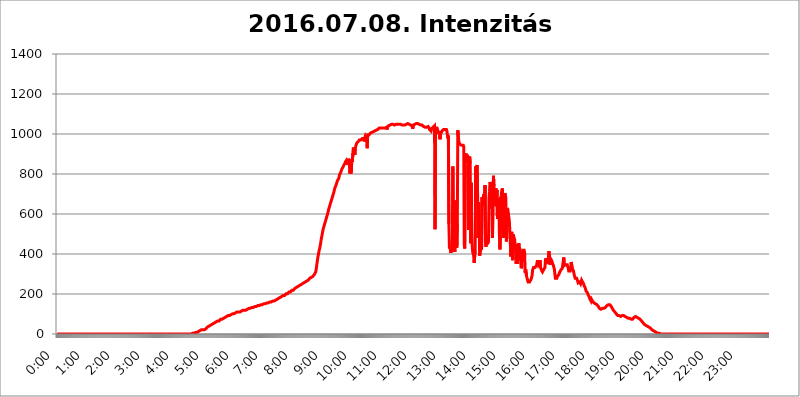
| Category | 2016.07.08. Intenzitás [W/m^2] |
|---|---|
| 0.0 | 0 |
| 0.0006944444444444445 | 0 |
| 0.001388888888888889 | 0 |
| 0.0020833333333333333 | 0 |
| 0.002777777777777778 | 0 |
| 0.003472222222222222 | 0 |
| 0.004166666666666667 | 0 |
| 0.004861111111111111 | 0 |
| 0.005555555555555556 | 0 |
| 0.0062499999999999995 | 0 |
| 0.006944444444444444 | 0 |
| 0.007638888888888889 | 0 |
| 0.008333333333333333 | 0 |
| 0.009027777777777779 | 0 |
| 0.009722222222222222 | 0 |
| 0.010416666666666666 | 0 |
| 0.011111111111111112 | 0 |
| 0.011805555555555555 | 0 |
| 0.012499999999999999 | 0 |
| 0.013194444444444444 | 0 |
| 0.013888888888888888 | 0 |
| 0.014583333333333332 | 0 |
| 0.015277777777777777 | 0 |
| 0.015972222222222224 | 0 |
| 0.016666666666666666 | 0 |
| 0.017361111111111112 | 0 |
| 0.018055555555555557 | 0 |
| 0.01875 | 0 |
| 0.019444444444444445 | 0 |
| 0.02013888888888889 | 0 |
| 0.020833333333333332 | 0 |
| 0.02152777777777778 | 0 |
| 0.022222222222222223 | 0 |
| 0.02291666666666667 | 0 |
| 0.02361111111111111 | 0 |
| 0.024305555555555556 | 0 |
| 0.024999999999999998 | 0 |
| 0.025694444444444447 | 0 |
| 0.02638888888888889 | 0 |
| 0.027083333333333334 | 0 |
| 0.027777777777777776 | 0 |
| 0.02847222222222222 | 0 |
| 0.029166666666666664 | 0 |
| 0.029861111111111113 | 0 |
| 0.030555555555555555 | 0 |
| 0.03125 | 0 |
| 0.03194444444444445 | 0 |
| 0.03263888888888889 | 0 |
| 0.03333333333333333 | 0 |
| 0.034027777777777775 | 0 |
| 0.034722222222222224 | 0 |
| 0.035416666666666666 | 0 |
| 0.036111111111111115 | 0 |
| 0.03680555555555556 | 0 |
| 0.0375 | 0 |
| 0.03819444444444444 | 0 |
| 0.03888888888888889 | 0 |
| 0.03958333333333333 | 0 |
| 0.04027777777777778 | 0 |
| 0.04097222222222222 | 0 |
| 0.041666666666666664 | 0 |
| 0.042361111111111106 | 0 |
| 0.04305555555555556 | 0 |
| 0.043750000000000004 | 0 |
| 0.044444444444444446 | 0 |
| 0.04513888888888889 | 0 |
| 0.04583333333333334 | 0 |
| 0.04652777777777778 | 0 |
| 0.04722222222222222 | 0 |
| 0.04791666666666666 | 0 |
| 0.04861111111111111 | 0 |
| 0.049305555555555554 | 0 |
| 0.049999999999999996 | 0 |
| 0.05069444444444445 | 0 |
| 0.051388888888888894 | 0 |
| 0.052083333333333336 | 0 |
| 0.05277777777777778 | 0 |
| 0.05347222222222222 | 0 |
| 0.05416666666666667 | 0 |
| 0.05486111111111111 | 0 |
| 0.05555555555555555 | 0 |
| 0.05625 | 0 |
| 0.05694444444444444 | 0 |
| 0.057638888888888885 | 0 |
| 0.05833333333333333 | 0 |
| 0.05902777777777778 | 0 |
| 0.059722222222222225 | 0 |
| 0.06041666666666667 | 0 |
| 0.061111111111111116 | 0 |
| 0.06180555555555556 | 0 |
| 0.0625 | 0 |
| 0.06319444444444444 | 0 |
| 0.06388888888888888 | 0 |
| 0.06458333333333334 | 0 |
| 0.06527777777777778 | 0 |
| 0.06597222222222222 | 0 |
| 0.06666666666666667 | 0 |
| 0.06736111111111111 | 0 |
| 0.06805555555555555 | 0 |
| 0.06874999999999999 | 0 |
| 0.06944444444444443 | 0 |
| 0.07013888888888889 | 0 |
| 0.07083333333333333 | 0 |
| 0.07152777777777779 | 0 |
| 0.07222222222222223 | 0 |
| 0.07291666666666667 | 0 |
| 0.07361111111111111 | 0 |
| 0.07430555555555556 | 0 |
| 0.075 | 0 |
| 0.07569444444444444 | 0 |
| 0.0763888888888889 | 0 |
| 0.07708333333333334 | 0 |
| 0.07777777777777778 | 0 |
| 0.07847222222222222 | 0 |
| 0.07916666666666666 | 0 |
| 0.0798611111111111 | 0 |
| 0.08055555555555556 | 0 |
| 0.08125 | 0 |
| 0.08194444444444444 | 0 |
| 0.08263888888888889 | 0 |
| 0.08333333333333333 | 0 |
| 0.08402777777777777 | 0 |
| 0.08472222222222221 | 0 |
| 0.08541666666666665 | 0 |
| 0.08611111111111112 | 0 |
| 0.08680555555555557 | 0 |
| 0.08750000000000001 | 0 |
| 0.08819444444444445 | 0 |
| 0.08888888888888889 | 0 |
| 0.08958333333333333 | 0 |
| 0.09027777777777778 | 0 |
| 0.09097222222222222 | 0 |
| 0.09166666666666667 | 0 |
| 0.09236111111111112 | 0 |
| 0.09305555555555556 | 0 |
| 0.09375 | 0 |
| 0.09444444444444444 | 0 |
| 0.09513888888888888 | 0 |
| 0.09583333333333333 | 0 |
| 0.09652777777777777 | 0 |
| 0.09722222222222222 | 0 |
| 0.09791666666666667 | 0 |
| 0.09861111111111111 | 0 |
| 0.09930555555555555 | 0 |
| 0.09999999999999999 | 0 |
| 0.10069444444444443 | 0 |
| 0.1013888888888889 | 0 |
| 0.10208333333333335 | 0 |
| 0.10277777777777779 | 0 |
| 0.10347222222222223 | 0 |
| 0.10416666666666667 | 0 |
| 0.10486111111111111 | 0 |
| 0.10555555555555556 | 0 |
| 0.10625 | 0 |
| 0.10694444444444444 | 0 |
| 0.1076388888888889 | 0 |
| 0.10833333333333334 | 0 |
| 0.10902777777777778 | 0 |
| 0.10972222222222222 | 0 |
| 0.1111111111111111 | 0 |
| 0.11180555555555556 | 0 |
| 0.11180555555555556 | 0 |
| 0.1125 | 0 |
| 0.11319444444444444 | 0 |
| 0.11388888888888889 | 0 |
| 0.11458333333333333 | 0 |
| 0.11527777777777777 | 0 |
| 0.11597222222222221 | 0 |
| 0.11666666666666665 | 0 |
| 0.1173611111111111 | 0 |
| 0.11805555555555557 | 0 |
| 0.11944444444444445 | 0 |
| 0.12013888888888889 | 0 |
| 0.12083333333333333 | 0 |
| 0.12152777777777778 | 0 |
| 0.12222222222222223 | 0 |
| 0.12291666666666667 | 0 |
| 0.12291666666666667 | 0 |
| 0.12361111111111112 | 0 |
| 0.12430555555555556 | 0 |
| 0.125 | 0 |
| 0.12569444444444444 | 0 |
| 0.12638888888888888 | 0 |
| 0.12708333333333333 | 0 |
| 0.16875 | 0 |
| 0.12847222222222224 | 0 |
| 0.12916666666666668 | 0 |
| 0.12986111111111112 | 0 |
| 0.13055555555555556 | 0 |
| 0.13125 | 0 |
| 0.13194444444444445 | 0 |
| 0.1326388888888889 | 0 |
| 0.13333333333333333 | 0 |
| 0.13402777777777777 | 0 |
| 0.13402777777777777 | 0 |
| 0.13472222222222222 | 0 |
| 0.13541666666666666 | 0 |
| 0.1361111111111111 | 0 |
| 0.13749999999999998 | 0 |
| 0.13819444444444443 | 0 |
| 0.1388888888888889 | 0 |
| 0.13958333333333334 | 0 |
| 0.14027777777777778 | 0 |
| 0.14097222222222222 | 0 |
| 0.14166666666666666 | 0 |
| 0.1423611111111111 | 0 |
| 0.14305555555555557 | 0 |
| 0.14375000000000002 | 0 |
| 0.14444444444444446 | 0 |
| 0.1451388888888889 | 0 |
| 0.1451388888888889 | 0 |
| 0.14652777777777778 | 0 |
| 0.14722222222222223 | 0 |
| 0.14791666666666667 | 0 |
| 0.1486111111111111 | 0 |
| 0.14930555555555555 | 0 |
| 0.15 | 0 |
| 0.15069444444444444 | 0 |
| 0.15138888888888888 | 0 |
| 0.15208333333333332 | 0 |
| 0.15277777777777776 | 0 |
| 0.15347222222222223 | 0 |
| 0.15416666666666667 | 0 |
| 0.15486111111111112 | 0 |
| 0.15555555555555556 | 0 |
| 0.15625 | 0 |
| 0.15694444444444444 | 0 |
| 0.15763888888888888 | 0 |
| 0.15833333333333333 | 0 |
| 0.15902777777777777 | 0 |
| 0.15972222222222224 | 0 |
| 0.16041666666666668 | 0 |
| 0.16111111111111112 | 0 |
| 0.16180555555555556 | 0 |
| 0.1625 | 0 |
| 0.16319444444444445 | 0 |
| 0.1638888888888889 | 0 |
| 0.16458333333333333 | 0 |
| 0.16527777777777777 | 0 |
| 0.16597222222222222 | 0 |
| 0.16666666666666666 | 0 |
| 0.1673611111111111 | 0 |
| 0.16805555555555554 | 0 |
| 0.16874999999999998 | 0 |
| 0.16944444444444443 | 0 |
| 0.17013888888888887 | 0 |
| 0.1708333333333333 | 0 |
| 0.17152777777777775 | 0 |
| 0.17222222222222225 | 0 |
| 0.1729166666666667 | 0 |
| 0.17361111111111113 | 0 |
| 0.17430555555555557 | 0 |
| 0.17500000000000002 | 0 |
| 0.17569444444444446 | 0 |
| 0.1763888888888889 | 0 |
| 0.17708333333333334 | 0 |
| 0.17777777777777778 | 0 |
| 0.17847222222222223 | 0 |
| 0.17916666666666667 | 0 |
| 0.1798611111111111 | 0 |
| 0.18055555555555555 | 0 |
| 0.18125 | 0 |
| 0.18194444444444444 | 0 |
| 0.1826388888888889 | 0 |
| 0.18333333333333335 | 0 |
| 0.1840277777777778 | 0 |
| 0.18472222222222223 | 0 |
| 0.18541666666666667 | 0 |
| 0.18611111111111112 | 0 |
| 0.18680555555555556 | 0 |
| 0.1875 | 0 |
| 0.18819444444444444 | 3.525 |
| 0.18888888888888888 | 3.525 |
| 0.18958333333333333 | 3.525 |
| 0.19027777777777777 | 3.525 |
| 0.1909722222222222 | 3.525 |
| 0.19166666666666665 | 3.525 |
| 0.19236111111111112 | 3.525 |
| 0.19305555555555554 | 3.525 |
| 0.19375 | 7.887 |
| 0.19444444444444445 | 7.887 |
| 0.1951388888888889 | 7.887 |
| 0.19583333333333333 | 7.887 |
| 0.19652777777777777 | 12.257 |
| 0.19722222222222222 | 12.257 |
| 0.19791666666666666 | 12.257 |
| 0.1986111111111111 | 12.257 |
| 0.19930555555555554 | 16.636 |
| 0.19999999999999998 | 16.636 |
| 0.20069444444444443 | 21.024 |
| 0.20138888888888887 | 16.636 |
| 0.2020833333333333 | 21.024 |
| 0.2027777777777778 | 21.024 |
| 0.2034722222222222 | 21.024 |
| 0.2041666666666667 | 21.024 |
| 0.20486111111111113 | 21.024 |
| 0.20555555555555557 | 21.024 |
| 0.20625000000000002 | 21.024 |
| 0.20694444444444446 | 25.419 |
| 0.2076388888888889 | 25.419 |
| 0.20833333333333334 | 25.419 |
| 0.20902777777777778 | 29.823 |
| 0.20972222222222223 | 29.823 |
| 0.21041666666666667 | 34.234 |
| 0.2111111111111111 | 38.653 |
| 0.21180555555555555 | 38.653 |
| 0.2125 | 38.653 |
| 0.21319444444444444 | 38.653 |
| 0.2138888888888889 | 43.079 |
| 0.21458333333333335 | 43.079 |
| 0.2152777777777778 | 43.079 |
| 0.21597222222222223 | 47.511 |
| 0.21666666666666667 | 47.511 |
| 0.21736111111111112 | 47.511 |
| 0.21805555555555556 | 47.511 |
| 0.21875 | 51.951 |
| 0.21944444444444444 | 51.951 |
| 0.22013888888888888 | 56.398 |
| 0.22083333333333333 | 56.398 |
| 0.22152777777777777 | 56.398 |
| 0.2222222222222222 | 56.398 |
| 0.22291666666666665 | 60.85 |
| 0.2236111111111111 | 60.85 |
| 0.22430555555555556 | 60.85 |
| 0.225 | 65.31 |
| 0.22569444444444445 | 65.31 |
| 0.2263888888888889 | 65.31 |
| 0.22708333333333333 | 65.31 |
| 0.22777777777777777 | 69.775 |
| 0.22847222222222222 | 69.775 |
| 0.22916666666666666 | 74.246 |
| 0.2298611111111111 | 74.246 |
| 0.23055555555555554 | 74.246 |
| 0.23124999999999998 | 74.246 |
| 0.23194444444444443 | 78.722 |
| 0.23263888888888887 | 78.722 |
| 0.2333333333333333 | 78.722 |
| 0.2340277777777778 | 83.205 |
| 0.2347222222222222 | 83.205 |
| 0.2354166666666667 | 83.205 |
| 0.23611111111111113 | 83.205 |
| 0.23680555555555557 | 87.692 |
| 0.23750000000000002 | 87.692 |
| 0.23819444444444446 | 87.692 |
| 0.2388888888888889 | 87.692 |
| 0.23958333333333334 | 92.184 |
| 0.24027777777777778 | 92.184 |
| 0.24097222222222223 | 92.184 |
| 0.24166666666666667 | 92.184 |
| 0.2423611111111111 | 92.184 |
| 0.24305555555555555 | 96.682 |
| 0.24375 | 96.682 |
| 0.24444444444444446 | 96.682 |
| 0.24513888888888888 | 101.184 |
| 0.24583333333333335 | 101.184 |
| 0.2465277777777778 | 101.184 |
| 0.24722222222222223 | 101.184 |
| 0.24791666666666667 | 101.184 |
| 0.24861111111111112 | 101.184 |
| 0.24930555555555556 | 105.69 |
| 0.25 | 105.69 |
| 0.25069444444444444 | 105.69 |
| 0.2513888888888889 | 105.69 |
| 0.2520833333333333 | 110.201 |
| 0.25277777777777777 | 110.201 |
| 0.2534722222222222 | 110.201 |
| 0.25416666666666665 | 110.201 |
| 0.2548611111111111 | 110.201 |
| 0.2555555555555556 | 110.201 |
| 0.25625000000000003 | 110.201 |
| 0.2569444444444445 | 114.716 |
| 0.2576388888888889 | 114.716 |
| 0.25833333333333336 | 114.716 |
| 0.2590277777777778 | 114.716 |
| 0.25972222222222224 | 114.716 |
| 0.2604166666666667 | 119.235 |
| 0.2611111111111111 | 119.235 |
| 0.26180555555555557 | 119.235 |
| 0.2625 | 119.235 |
| 0.26319444444444445 | 119.235 |
| 0.2638888888888889 | 119.235 |
| 0.26458333333333334 | 119.235 |
| 0.2652777777777778 | 123.758 |
| 0.2659722222222222 | 123.758 |
| 0.26666666666666666 | 123.758 |
| 0.2673611111111111 | 123.758 |
| 0.26805555555555555 | 123.758 |
| 0.26875 | 128.284 |
| 0.26944444444444443 | 128.284 |
| 0.2701388888888889 | 128.284 |
| 0.2708333333333333 | 128.284 |
| 0.27152777777777776 | 128.284 |
| 0.2722222222222222 | 128.284 |
| 0.27291666666666664 | 132.814 |
| 0.2736111111111111 | 132.814 |
| 0.2743055555555555 | 132.814 |
| 0.27499999999999997 | 132.814 |
| 0.27569444444444446 | 132.814 |
| 0.27638888888888885 | 137.347 |
| 0.27708333333333335 | 137.347 |
| 0.2777777777777778 | 137.347 |
| 0.27847222222222223 | 137.347 |
| 0.2791666666666667 | 137.347 |
| 0.2798611111111111 | 137.347 |
| 0.28055555555555556 | 137.347 |
| 0.28125 | 141.884 |
| 0.28194444444444444 | 141.884 |
| 0.2826388888888889 | 141.884 |
| 0.2833333333333333 | 141.884 |
| 0.28402777777777777 | 141.884 |
| 0.2847222222222222 | 141.884 |
| 0.28541666666666665 | 146.423 |
| 0.28611111111111115 | 146.423 |
| 0.28680555555555554 | 146.423 |
| 0.28750000000000003 | 146.423 |
| 0.2881944444444445 | 146.423 |
| 0.2888888888888889 | 146.423 |
| 0.28958333333333336 | 150.964 |
| 0.2902777777777778 | 150.964 |
| 0.29097222222222224 | 150.964 |
| 0.2916666666666667 | 150.964 |
| 0.2923611111111111 | 155.509 |
| 0.29305555555555557 | 155.509 |
| 0.29375 | 155.509 |
| 0.29444444444444445 | 155.509 |
| 0.2951388888888889 | 155.509 |
| 0.29583333333333334 | 155.509 |
| 0.2965277777777778 | 155.509 |
| 0.2972222222222222 | 160.056 |
| 0.29791666666666666 | 160.056 |
| 0.2986111111111111 | 160.056 |
| 0.29930555555555555 | 160.056 |
| 0.3 | 160.056 |
| 0.30069444444444443 | 164.605 |
| 0.3013888888888889 | 164.605 |
| 0.3020833333333333 | 164.605 |
| 0.30277777777777776 | 164.605 |
| 0.3034722222222222 | 164.605 |
| 0.30416666666666664 | 164.605 |
| 0.3048611111111111 | 169.156 |
| 0.3055555555555555 | 169.156 |
| 0.30624999999999997 | 169.156 |
| 0.3069444444444444 | 169.156 |
| 0.3076388888888889 | 169.156 |
| 0.30833333333333335 | 173.709 |
| 0.3090277777777778 | 173.709 |
| 0.30972222222222223 | 173.709 |
| 0.3104166666666667 | 178.264 |
| 0.3111111111111111 | 178.264 |
| 0.31180555555555556 | 178.264 |
| 0.3125 | 182.82 |
| 0.31319444444444444 | 182.82 |
| 0.3138888888888889 | 182.82 |
| 0.3145833333333333 | 187.378 |
| 0.31527777777777777 | 187.378 |
| 0.3159722222222222 | 191.937 |
| 0.31666666666666665 | 191.937 |
| 0.31736111111111115 | 191.937 |
| 0.31805555555555554 | 191.937 |
| 0.31875000000000003 | 191.937 |
| 0.3194444444444445 | 196.497 |
| 0.3201388888888889 | 196.497 |
| 0.32083333333333336 | 201.058 |
| 0.3215277777777778 | 201.058 |
| 0.32222222222222224 | 201.058 |
| 0.3229166666666667 | 201.058 |
| 0.3236111111111111 | 205.62 |
| 0.32430555555555557 | 205.62 |
| 0.325 | 210.182 |
| 0.32569444444444445 | 210.182 |
| 0.3263888888888889 | 210.182 |
| 0.32708333333333334 | 210.182 |
| 0.3277777777777778 | 214.746 |
| 0.3284722222222222 | 214.746 |
| 0.32916666666666666 | 219.309 |
| 0.3298611111111111 | 219.309 |
| 0.33055555555555555 | 219.309 |
| 0.33125 | 219.309 |
| 0.33194444444444443 | 223.873 |
| 0.3326388888888889 | 223.873 |
| 0.3333333333333333 | 228.436 |
| 0.3340277777777778 | 228.436 |
| 0.3347222222222222 | 228.436 |
| 0.3354166666666667 | 233 |
| 0.3361111111111111 | 233 |
| 0.3368055555555556 | 233 |
| 0.33749999999999997 | 237.564 |
| 0.33819444444444446 | 237.564 |
| 0.33888888888888885 | 242.127 |
| 0.33958333333333335 | 242.127 |
| 0.34027777777777773 | 242.127 |
| 0.34097222222222223 | 246.689 |
| 0.3416666666666666 | 246.689 |
| 0.3423611111111111 | 246.689 |
| 0.3430555555555555 | 251.251 |
| 0.34375 | 251.251 |
| 0.3444444444444445 | 251.251 |
| 0.3451388888888889 | 255.813 |
| 0.3458333333333334 | 255.813 |
| 0.34652777777777777 | 255.813 |
| 0.34722222222222227 | 260.373 |
| 0.34791666666666665 | 260.373 |
| 0.34861111111111115 | 260.373 |
| 0.34930555555555554 | 260.373 |
| 0.35000000000000003 | 264.932 |
| 0.3506944444444444 | 264.932 |
| 0.3513888888888889 | 269.49 |
| 0.3520833333333333 | 269.49 |
| 0.3527777777777778 | 274.047 |
| 0.3534722222222222 | 274.047 |
| 0.3541666666666667 | 278.603 |
| 0.3548611111111111 | 278.603 |
| 0.35555555555555557 | 283.156 |
| 0.35625 | 283.156 |
| 0.35694444444444445 | 283.156 |
| 0.3576388888888889 | 287.709 |
| 0.35833333333333334 | 287.709 |
| 0.3590277777777778 | 292.259 |
| 0.3597222222222222 | 292.259 |
| 0.36041666666666666 | 296.808 |
| 0.3611111111111111 | 296.808 |
| 0.36180555555555555 | 301.354 |
| 0.3625 | 310.44 |
| 0.36319444444444443 | 324.052 |
| 0.3638888888888889 | 342.162 |
| 0.3645833333333333 | 360.221 |
| 0.3652777777777778 | 378.224 |
| 0.3659722222222222 | 391.685 |
| 0.3666666666666667 | 405.108 |
| 0.3673611111111111 | 418.492 |
| 0.3680555555555556 | 427.39 |
| 0.36874999999999997 | 440.702 |
| 0.36944444444444446 | 453.968 |
| 0.37013888888888885 | 471.582 |
| 0.37083333333333335 | 484.735 |
| 0.37152777777777773 | 497.836 |
| 0.37222222222222223 | 510.885 |
| 0.3729166666666666 | 523.88 |
| 0.3736111111111111 | 532.513 |
| 0.3743055555555555 | 541.121 |
| 0.375 | 549.704 |
| 0.3756944444444445 | 558.261 |
| 0.3763888888888889 | 566.793 |
| 0.3770833333333334 | 575.299 |
| 0.37777777777777777 | 583.779 |
| 0.37847222222222227 | 592.233 |
| 0.37916666666666665 | 600.661 |
| 0.37986111111111115 | 609.062 |
| 0.38055555555555554 | 621.613 |
| 0.38125000000000003 | 629.948 |
| 0.3819444444444444 | 638.256 |
| 0.3826388888888889 | 646.537 |
| 0.3833333333333333 | 654.791 |
| 0.3840277777777778 | 663.019 |
| 0.3847222222222222 | 671.22 |
| 0.3854166666666667 | 679.395 |
| 0.3861111111111111 | 687.544 |
| 0.38680555555555557 | 695.666 |
| 0.3875 | 703.762 |
| 0.38819444444444445 | 711.832 |
| 0.3888888888888889 | 723.889 |
| 0.38958333333333334 | 731.896 |
| 0.3902777777777778 | 735.89 |
| 0.3909722222222222 | 743.859 |
| 0.39166666666666666 | 751.803 |
| 0.3923611111111111 | 759.723 |
| 0.39305555555555555 | 767.62 |
| 0.39375 | 771.559 |
| 0.39444444444444443 | 775.492 |
| 0.3951388888888889 | 783.342 |
| 0.3958333333333333 | 795.074 |
| 0.3965277777777778 | 795.074 |
| 0.3972222222222222 | 798.974 |
| 0.3979166666666667 | 810.641 |
| 0.3986111111111111 | 818.392 |
| 0.3993055555555556 | 826.123 |
| 0.39999999999999997 | 826.123 |
| 0.40069444444444446 | 833.834 |
| 0.40138888888888885 | 837.682 |
| 0.40208333333333335 | 845.365 |
| 0.40277777777777773 | 849.199 |
| 0.40347222222222223 | 853.029 |
| 0.4041666666666666 | 860.676 |
| 0.4048611111111111 | 864.493 |
| 0.4055555555555555 | 868.305 |
| 0.40625 | 872.114 |
| 0.4069444444444445 | 872.114 |
| 0.4076388888888889 | 845.365 |
| 0.4083333333333334 | 875.918 |
| 0.40902777777777777 | 879.719 |
| 0.40972222222222227 | 860.676 |
| 0.41041666666666665 | 802.868 |
| 0.41111111111111115 | 837.682 |
| 0.41180555555555554 | 802.868 |
| 0.41250000000000003 | 810.641 |
| 0.4131944444444444 | 875.918 |
| 0.4138888888888889 | 860.676 |
| 0.4145833333333333 | 902.447 |
| 0.4152777777777778 | 932.576 |
| 0.4159722222222222 | 936.33 |
| 0.4166666666666667 | 936.33 |
| 0.4173611111111111 | 894.885 |
| 0.41805555555555557 | 928.819 |
| 0.41875 | 940.082 |
| 0.41944444444444445 | 947.58 |
| 0.4201388888888889 | 955.071 |
| 0.42083333333333334 | 958.814 |
| 0.4215277777777778 | 958.814 |
| 0.4222222222222222 | 962.555 |
| 0.42291666666666666 | 966.295 |
| 0.4236111111111111 | 970.034 |
| 0.42430555555555555 | 970.034 |
| 0.425 | 970.034 |
| 0.42569444444444443 | 970.034 |
| 0.4263888888888889 | 973.772 |
| 0.4270833333333333 | 973.772 |
| 0.4277777777777778 | 977.508 |
| 0.4284722222222222 | 977.508 |
| 0.4291666666666667 | 981.244 |
| 0.4298611111111111 | 977.508 |
| 0.4305555555555556 | 962.555 |
| 0.43124999999999997 | 981.244 |
| 0.43194444444444446 | 988.714 |
| 0.43263888888888885 | 988.714 |
| 0.43333333333333335 | 988.714 |
| 0.43402777777777773 | 970.034 |
| 0.43472222222222223 | 928.819 |
| 0.4354166666666666 | 996.182 |
| 0.4361111111111111 | 996.182 |
| 0.4368055555555555 | 999.916 |
| 0.4375 | 996.182 |
| 0.4381944444444445 | 999.916 |
| 0.4388888888888889 | 1003.65 |
| 0.4395833333333334 | 999.916 |
| 0.44027777777777777 | 1003.65 |
| 0.44097222222222227 | 1007.383 |
| 0.44166666666666665 | 1003.65 |
| 0.44236111111111115 | 1011.118 |
| 0.44305555555555554 | 1011.118 |
| 0.44375000000000003 | 1011.118 |
| 0.4444444444444444 | 1014.852 |
| 0.4451388888888889 | 1014.852 |
| 0.4458333333333333 | 1014.852 |
| 0.4465277777777778 | 1018.587 |
| 0.4472222222222222 | 1018.587 |
| 0.4479166666666667 | 1022.323 |
| 0.4486111111111111 | 1022.323 |
| 0.44930555555555557 | 1022.323 |
| 0.45 | 1026.06 |
| 0.45069444444444445 | 1026.06 |
| 0.4513888888888889 | 1029.798 |
| 0.45208333333333334 | 1029.798 |
| 0.4527777777777778 | 1026.06 |
| 0.4534722222222222 | 1029.798 |
| 0.45416666666666666 | 1029.798 |
| 0.4548611111111111 | 1029.798 |
| 0.45555555555555555 | 1029.798 |
| 0.45625 | 1029.798 |
| 0.45694444444444443 | 1029.798 |
| 0.4576388888888889 | 1029.798 |
| 0.4583333333333333 | 1029.798 |
| 0.4590277777777778 | 1029.798 |
| 0.4597222222222222 | 1029.798 |
| 0.4604166666666667 | 1029.798 |
| 0.4611111111111111 | 1029.798 |
| 0.4618055555555556 | 1033.537 |
| 0.46249999999999997 | 1022.323 |
| 0.46319444444444446 | 1033.537 |
| 0.46388888888888885 | 1037.277 |
| 0.46458333333333335 | 1041.019 |
| 0.46527777777777773 | 1041.019 |
| 0.46597222222222223 | 1044.762 |
| 0.4666666666666666 | 1044.762 |
| 0.4673611111111111 | 1044.762 |
| 0.4680555555555555 | 1044.762 |
| 0.46875 | 1048.508 |
| 0.4694444444444445 | 1048.508 |
| 0.4701388888888889 | 1044.762 |
| 0.4708333333333334 | 1048.508 |
| 0.47152777777777777 | 1048.508 |
| 0.47222222222222227 | 1048.508 |
| 0.47291666666666665 | 1044.762 |
| 0.47361111111111115 | 1048.508 |
| 0.47430555555555554 | 1048.508 |
| 0.47500000000000003 | 1048.508 |
| 0.4756944444444444 | 1052.255 |
| 0.4763888888888889 | 1052.255 |
| 0.4770833333333333 | 1048.508 |
| 0.4777777777777778 | 1048.508 |
| 0.4784722222222222 | 1048.508 |
| 0.4791666666666667 | 1048.508 |
| 0.4798611111111111 | 1048.508 |
| 0.48055555555555557 | 1048.508 |
| 0.48125 | 1048.508 |
| 0.48194444444444445 | 1044.762 |
| 0.4826388888888889 | 1044.762 |
| 0.48333333333333334 | 1044.762 |
| 0.4840277777777778 | 1044.762 |
| 0.4847222222222222 | 1044.762 |
| 0.48541666666666666 | 1044.762 |
| 0.4861111111111111 | 1044.762 |
| 0.48680555555555555 | 1044.762 |
| 0.4875 | 1044.762 |
| 0.48819444444444443 | 1048.508 |
| 0.4888888888888889 | 1044.762 |
| 0.4895833333333333 | 1048.508 |
| 0.4902777777777778 | 1052.255 |
| 0.4909722222222222 | 1052.255 |
| 0.4916666666666667 | 1052.255 |
| 0.4923611111111111 | 1052.255 |
| 0.4930555555555556 | 1048.508 |
| 0.49374999999999997 | 1048.508 |
| 0.49444444444444446 | 1052.255 |
| 0.49513888888888885 | 1048.508 |
| 0.49583333333333335 | 1044.762 |
| 0.49652777777777773 | 1044.762 |
| 0.49722222222222223 | 1041.019 |
| 0.4979166666666666 | 1037.277 |
| 0.4986111111111111 | 1026.06 |
| 0.4993055555555555 | 1044.762 |
| 0.5 | 1041.019 |
| 0.5006944444444444 | 1044.762 |
| 0.5013888888888889 | 1048.508 |
| 0.5020833333333333 | 1052.255 |
| 0.5027777777777778 | 1052.255 |
| 0.5034722222222222 | 1052.255 |
| 0.5041666666666667 | 1052.255 |
| 0.5048611111111111 | 1052.255 |
| 0.5055555555555555 | 1052.255 |
| 0.50625 | 1052.255 |
| 0.5069444444444444 | 1048.508 |
| 0.5076388888888889 | 1048.508 |
| 0.5083333333333333 | 1048.508 |
| 0.5090277777777777 | 1044.762 |
| 0.5097222222222222 | 1044.762 |
| 0.5104166666666666 | 1044.762 |
| 0.5111111111111112 | 1044.762 |
| 0.5118055555555555 | 1044.762 |
| 0.5125000000000001 | 1044.762 |
| 0.5131944444444444 | 1041.019 |
| 0.513888888888889 | 1037.277 |
| 0.5145833333333333 | 1037.277 |
| 0.5152777777777778 | 1037.277 |
| 0.5159722222222222 | 1033.537 |
| 0.5166666666666667 | 1033.537 |
| 0.517361111111111 | 1033.537 |
| 0.5180555555555556 | 1033.537 |
| 0.5187499999999999 | 1033.537 |
| 0.5194444444444445 | 1033.537 |
| 0.5201388888888888 | 1037.277 |
| 0.5208333333333334 | 1033.537 |
| 0.5215277777777778 | 1029.798 |
| 0.5222222222222223 | 1022.323 |
| 0.5229166666666667 | 1018.587 |
| 0.5236111111111111 | 1026.06 |
| 0.5243055555555556 | 1014.852 |
| 0.525 | 1026.06 |
| 0.5256944444444445 | 1029.798 |
| 0.5263888888888889 | 1029.798 |
| 0.5270833333333333 | 1033.537 |
| 0.5277777777777778 | 1033.537 |
| 0.5284722222222222 | 1033.537 |
| 0.5291666666666667 | 1041.019 |
| 0.5298611111111111 | 523.88 |
| 0.5305555555555556 | 1029.798 |
| 0.53125 | 1029.798 |
| 0.5319444444444444 | 1029.798 |
| 0.5326388888888889 | 1029.798 |
| 0.5333333333333333 | 1022.323 |
| 0.5340277777777778 | 1018.587 |
| 0.5347222222222222 | 1007.383 |
| 0.5354166666666667 | 999.916 |
| 0.5361111111111111 | 1014.852 |
| 0.5368055555555555 | 973.772 |
| 0.5375 | 1014.852 |
| 0.5381944444444444 | 1003.65 |
| 0.5388888888888889 | 1007.383 |
| 0.5395833333333333 | 1014.852 |
| 0.5402777777777777 | 1014.852 |
| 0.5409722222222222 | 1018.587 |
| 0.5416666666666666 | 1022.323 |
| 0.5423611111111112 | 1026.06 |
| 0.5430555555555555 | 1018.587 |
| 0.5437500000000001 | 1022.323 |
| 0.5444444444444444 | 1018.587 |
| 0.545138888888889 | 1018.587 |
| 0.5458333333333333 | 1022.323 |
| 0.5465277777777778 | 1014.852 |
| 0.5472222222222222 | 1011.118 |
| 0.5479166666666667 | 977.508 |
| 0.548611111111111 | 992.448 |
| 0.5493055555555556 | 549.704 |
| 0.5499999999999999 | 431.833 |
| 0.5506944444444445 | 427.39 |
| 0.5513888888888888 | 422.943 |
| 0.5520833333333334 | 405.108 |
| 0.5527777777777778 | 431.833 |
| 0.5534722222222223 | 414.035 |
| 0.5541666666666667 | 471.582 |
| 0.5548611111111111 | 837.682 |
| 0.5555555555555556 | 453.968 |
| 0.55625 | 436.27 |
| 0.5569444444444445 | 422.943 |
| 0.5576388888888889 | 409.574 |
| 0.5583333333333333 | 405.108 |
| 0.5590277777777778 | 667.123 |
| 0.5597222222222222 | 638.256 |
| 0.5604166666666667 | 431.833 |
| 0.5611111111111111 | 553.986 |
| 0.5618055555555556 | 1018.587 |
| 0.5625 | 988.714 |
| 0.5631944444444444 | 966.295 |
| 0.5638888888888889 | 955.071 |
| 0.5645833333333333 | 951.327 |
| 0.5652777777777778 | 947.58 |
| 0.5659722222222222 | 951.327 |
| 0.5666666666666667 | 947.58 |
| 0.5673611111111111 | 943.832 |
| 0.5680555555555555 | 947.58 |
| 0.56875 | 947.58 |
| 0.5694444444444444 | 943.832 |
| 0.5701388888888889 | 936.33 |
| 0.5708333333333333 | 445.129 |
| 0.5715277777777777 | 427.39 |
| 0.5722222222222222 | 845.365 |
| 0.5729166666666666 | 875.918 |
| 0.5736111111111112 | 902.447 |
| 0.5743055555555555 | 856.855 |
| 0.5750000000000001 | 894.885 |
| 0.5756944444444444 | 894.885 |
| 0.576388888888889 | 883.516 |
| 0.5770833333333333 | 519.555 |
| 0.5777777777777778 | 875.918 |
| 0.5784722222222222 | 887.309 |
| 0.5791666666666667 | 853.029 |
| 0.579861111111111 | 453.968 |
| 0.5805555555555556 | 755.766 |
| 0.5812499999999999 | 519.555 |
| 0.5819444444444445 | 449.551 |
| 0.5826388888888888 | 409.574 |
| 0.5833333333333334 | 405.108 |
| 0.5840277777777778 | 391.685 |
| 0.5847222222222223 | 355.712 |
| 0.5854166666666667 | 360.221 |
| 0.5861111111111111 | 418.492 |
| 0.5868055555555556 | 837.682 |
| 0.5875 | 743.859 |
| 0.5881944444444445 | 833.834 |
| 0.5888888888888889 | 845.365 |
| 0.5895833333333333 | 683.473 |
| 0.5902777777777778 | 480.356 |
| 0.5909722222222222 | 658.909 |
| 0.5916666666666667 | 629.948 |
| 0.5923611111111111 | 391.685 |
| 0.5930555555555556 | 405.108 |
| 0.59375 | 418.492 |
| 0.5944444444444444 | 431.833 |
| 0.5951388888888889 | 422.943 |
| 0.5958333333333333 | 683.473 |
| 0.5965277777777778 | 642.4 |
| 0.5972222222222222 | 667.123 |
| 0.5979166666666667 | 699.717 |
| 0.5986111111111111 | 695.666 |
| 0.5993055555555555 | 646.537 |
| 0.6 | 743.859 |
| 0.6006944444444444 | 458.38 |
| 0.6013888888888889 | 436.27 |
| 0.6020833333333333 | 493.475 |
| 0.6027777777777777 | 462.786 |
| 0.6034722222222222 | 449.551 |
| 0.6041666666666666 | 449.551 |
| 0.6048611111111112 | 467.187 |
| 0.6055555555555555 | 679.395 |
| 0.6062500000000001 | 711.832 |
| 0.6069444444444444 | 759.723 |
| 0.607638888888889 | 751.803 |
| 0.6083333333333333 | 711.832 |
| 0.6090277777777778 | 625.784 |
| 0.6097222222222222 | 727.896 |
| 0.6104166666666667 | 480.356 |
| 0.611111111111111 | 658.909 |
| 0.6118055555555556 | 791.169 |
| 0.6124999999999999 | 739.877 |
| 0.6131944444444445 | 711.832 |
| 0.6138888888888888 | 663.019 |
| 0.6145833333333334 | 642.4 |
| 0.6152777777777778 | 727.896 |
| 0.6159722222222223 | 638.256 |
| 0.6166666666666667 | 719.877 |
| 0.6173611111111111 | 575.299 |
| 0.6180555555555556 | 658.909 |
| 0.61875 | 658.909 |
| 0.6194444444444445 | 667.123 |
| 0.6201388888888889 | 493.475 |
| 0.6208333333333333 | 422.943 |
| 0.6215277777777778 | 497.836 |
| 0.6222222222222222 | 642.4 |
| 0.6229166666666667 | 703.762 |
| 0.6236111111111111 | 719.877 |
| 0.6243055555555556 | 727.896 |
| 0.625 | 658.909 |
| 0.6256944444444444 | 480.356 |
| 0.6263888888888889 | 667.123 |
| 0.6270833333333333 | 687.544 |
| 0.6277777777777778 | 703.762 |
| 0.6284722222222222 | 695.666 |
| 0.6291666666666667 | 679.395 |
| 0.6298611111111111 | 462.786 |
| 0.6305555555555555 | 484.735 |
| 0.63125 | 629.948 |
| 0.6319444444444444 | 621.613 |
| 0.6326388888888889 | 604.864 |
| 0.6333333333333333 | 583.779 |
| 0.6340277777777777 | 566.793 |
| 0.6347222222222222 | 519.555 |
| 0.6354166666666666 | 458.38 |
| 0.6361111111111112 | 387.202 |
| 0.6368055555555555 | 480.356 |
| 0.6375000000000001 | 510.885 |
| 0.6381944444444444 | 453.968 |
| 0.638888888888889 | 369.23 |
| 0.6395833333333333 | 497.836 |
| 0.6402777777777778 | 484.735 |
| 0.6409722222222222 | 484.735 |
| 0.6416666666666667 | 471.582 |
| 0.642361111111111 | 422.943 |
| 0.6430555555555556 | 449.551 |
| 0.6437499999999999 | 351.198 |
| 0.6444444444444445 | 405.108 |
| 0.6451388888888888 | 351.198 |
| 0.6458333333333334 | 440.702 |
| 0.6465277777777778 | 409.574 |
| 0.6472222222222223 | 453.968 |
| 0.6479166666666667 | 436.27 |
| 0.6486111111111111 | 427.39 |
| 0.6493055555555556 | 427.39 |
| 0.65 | 431.833 |
| 0.6506944444444445 | 328.584 |
| 0.6513888888888889 | 337.639 |
| 0.6520833333333333 | 391.685 |
| 0.6527777777777778 | 418.492 |
| 0.6534722222222222 | 418.492 |
| 0.6541666666666667 | 422.943 |
| 0.6548611111111111 | 418.492 |
| 0.6555555555555556 | 405.108 |
| 0.65625 | 305.898 |
| 0.6569444444444444 | 324.052 |
| 0.6576388888888889 | 328.584 |
| 0.6583333333333333 | 287.709 |
| 0.6590277777777778 | 283.156 |
| 0.6597222222222222 | 269.49 |
| 0.6604166666666667 | 260.373 |
| 0.6611111111111111 | 255.813 |
| 0.6618055555555555 | 255.813 |
| 0.6625 | 260.373 |
| 0.6631944444444444 | 264.932 |
| 0.6638888888888889 | 264.932 |
| 0.6645833333333333 | 274.047 |
| 0.6652777777777777 | 283.156 |
| 0.6659722222222222 | 292.259 |
| 0.6666666666666666 | 319.517 |
| 0.6673611111111111 | 319.517 |
| 0.6680555555555556 | 333.113 |
| 0.6687500000000001 | 333.113 |
| 0.6694444444444444 | 333.113 |
| 0.6701388888888888 | 333.113 |
| 0.6708333333333334 | 333.113 |
| 0.6715277777777778 | 333.113 |
| 0.6722222222222222 | 342.162 |
| 0.6729166666666666 | 346.682 |
| 0.6736111111111112 | 369.23 |
| 0.6743055555555556 | 373.729 |
| 0.6749999999999999 | 346.682 |
| 0.6756944444444444 | 342.162 |
| 0.6763888888888889 | 355.712 |
| 0.6770833333333334 | 369.23 |
| 0.6777777777777777 | 333.113 |
| 0.6784722222222223 | 328.584 |
| 0.6791666666666667 | 319.517 |
| 0.6798611111111111 | 314.98 |
| 0.6805555555555555 | 310.44 |
| 0.68125 | 314.98 |
| 0.6819444444444445 | 319.517 |
| 0.6826388888888889 | 324.052 |
| 0.6833333333333332 | 324.052 |
| 0.6840277777777778 | 333.113 |
| 0.6847222222222222 | 369.23 |
| 0.6854166666666667 | 378.224 |
| 0.686111111111111 | 351.198 |
| 0.6868055555555556 | 355.712 |
| 0.6875 | 364.728 |
| 0.6881944444444444 | 373.729 |
| 0.688888888888889 | 382.715 |
| 0.6895833333333333 | 414.035 |
| 0.6902777777777778 | 382.715 |
| 0.6909722222222222 | 346.682 |
| 0.6916666666666668 | 378.224 |
| 0.6923611111111111 | 373.729 |
| 0.6930555555555555 | 378.224 |
| 0.69375 | 364.728 |
| 0.6944444444444445 | 355.712 |
| 0.6951388888888889 | 351.198 |
| 0.6958333333333333 | 342.162 |
| 0.6965277777777777 | 333.113 |
| 0.6972222222222223 | 324.052 |
| 0.6979166666666666 | 328.584 |
| 0.6986111111111111 | 278.603 |
| 0.6993055555555556 | 278.603 |
| 0.7000000000000001 | 278.603 |
| 0.7006944444444444 | 278.603 |
| 0.7013888888888888 | 287.709 |
| 0.7020833333333334 | 292.259 |
| 0.7027777777777778 | 292.259 |
| 0.7034722222222222 | 296.808 |
| 0.7041666666666666 | 301.354 |
| 0.7048611111111112 | 310.44 |
| 0.7055555555555556 | 314.98 |
| 0.7062499999999999 | 319.517 |
| 0.7069444444444444 | 314.98 |
| 0.7076388888888889 | 319.517 |
| 0.7083333333333334 | 328.584 |
| 0.7090277777777777 | 333.113 |
| 0.7097222222222223 | 333.113 |
| 0.7104166666666667 | 382.715 |
| 0.7111111111111111 | 342.162 |
| 0.7118055555555555 | 346.682 |
| 0.7125 | 346.682 |
| 0.7131944444444445 | 346.682 |
| 0.7138888888888889 | 342.162 |
| 0.7145833333333332 | 346.682 |
| 0.7152777777777778 | 346.682 |
| 0.7159722222222222 | 342.162 |
| 0.7166666666666667 | 328.584 |
| 0.717361111111111 | 314.98 |
| 0.7180555555555556 | 314.98 |
| 0.71875 | 314.98 |
| 0.7194444444444444 | 314.98 |
| 0.720138888888889 | 324.052 |
| 0.7208333333333333 | 360.221 |
| 0.7215277777777778 | 355.712 |
| 0.7222222222222222 | 328.584 |
| 0.7229166666666668 | 324.052 |
| 0.7236111111111111 | 319.517 |
| 0.7243055555555555 | 310.44 |
| 0.725 | 296.808 |
| 0.7256944444444445 | 287.709 |
| 0.7263888888888889 | 278.603 |
| 0.7270833333333333 | 278.603 |
| 0.7277777777777777 | 278.603 |
| 0.7284722222222223 | 278.603 |
| 0.7291666666666666 | 274.047 |
| 0.7298611111111111 | 264.932 |
| 0.7305555555555556 | 255.813 |
| 0.7312500000000001 | 255.813 |
| 0.7319444444444444 | 255.813 |
| 0.7326388888888888 | 260.373 |
| 0.7333333333333334 | 264.932 |
| 0.7340277777777778 | 251.251 |
| 0.7347222222222222 | 246.689 |
| 0.7354166666666666 | 269.49 |
| 0.7361111111111112 | 264.932 |
| 0.7368055555555556 | 260.373 |
| 0.7374999999999999 | 255.813 |
| 0.7381944444444444 | 251.251 |
| 0.7388888888888889 | 242.127 |
| 0.7395833333333334 | 242.127 |
| 0.7402777777777777 | 233 |
| 0.7409722222222223 | 228.436 |
| 0.7416666666666667 | 214.746 |
| 0.7423611111111111 | 214.746 |
| 0.7430555555555555 | 214.746 |
| 0.74375 | 205.62 |
| 0.7444444444444445 | 196.497 |
| 0.7451388888888889 | 191.937 |
| 0.7458333333333332 | 187.378 |
| 0.7465277777777778 | 182.82 |
| 0.7472222222222222 | 173.709 |
| 0.7479166666666667 | 173.709 |
| 0.748611111111111 | 164.605 |
| 0.7493055555555556 | 173.709 |
| 0.75 | 169.156 |
| 0.7506944444444444 | 164.605 |
| 0.751388888888889 | 164.605 |
| 0.7520833333333333 | 160.056 |
| 0.7527777777777778 | 155.509 |
| 0.7534722222222222 | 155.509 |
| 0.7541666666666668 | 155.509 |
| 0.7548611111111111 | 150.964 |
| 0.7555555555555555 | 146.423 |
| 0.75625 | 146.423 |
| 0.7569444444444445 | 146.423 |
| 0.7576388888888889 | 141.884 |
| 0.7583333333333333 | 141.884 |
| 0.7590277777777777 | 137.347 |
| 0.7597222222222223 | 132.814 |
| 0.7604166666666666 | 128.284 |
| 0.7611111111111111 | 123.758 |
| 0.7618055555555556 | 123.758 |
| 0.7625000000000001 | 123.758 |
| 0.7631944444444444 | 123.758 |
| 0.7638888888888888 | 128.284 |
| 0.7645833333333334 | 128.284 |
| 0.7652777777777778 | 128.284 |
| 0.7659722222222222 | 128.284 |
| 0.7666666666666666 | 128.284 |
| 0.7673611111111112 | 128.284 |
| 0.7680555555555556 | 128.284 |
| 0.7687499999999999 | 132.814 |
| 0.7694444444444444 | 137.347 |
| 0.7701388888888889 | 137.347 |
| 0.7708333333333334 | 141.884 |
| 0.7715277777777777 | 141.884 |
| 0.7722222222222223 | 146.423 |
| 0.7729166666666667 | 146.423 |
| 0.7736111111111111 | 146.423 |
| 0.7743055555555555 | 146.423 |
| 0.775 | 146.423 |
| 0.7756944444444445 | 141.884 |
| 0.7763888888888889 | 141.884 |
| 0.7770833333333332 | 137.347 |
| 0.7777777777777778 | 137.347 |
| 0.7784722222222222 | 128.284 |
| 0.7791666666666667 | 123.758 |
| 0.779861111111111 | 119.235 |
| 0.7805555555555556 | 114.716 |
| 0.78125 | 114.716 |
| 0.7819444444444444 | 110.201 |
| 0.782638888888889 | 105.69 |
| 0.7833333333333333 | 105.69 |
| 0.7840277777777778 | 101.184 |
| 0.7847222222222222 | 101.184 |
| 0.7854166666666668 | 96.682 |
| 0.7861111111111111 | 92.184 |
| 0.7868055555555555 | 92.184 |
| 0.7875 | 92.184 |
| 0.7881944444444445 | 92.184 |
| 0.7888888888888889 | 92.184 |
| 0.7895833333333333 | 87.692 |
| 0.7902777777777777 | 87.692 |
| 0.7909722222222223 | 92.184 |
| 0.7916666666666666 | 92.184 |
| 0.7923611111111111 | 92.184 |
| 0.7930555555555556 | 92.184 |
| 0.7937500000000001 | 92.184 |
| 0.7944444444444444 | 92.184 |
| 0.7951388888888888 | 87.692 |
| 0.7958333333333334 | 87.692 |
| 0.7965277777777778 | 87.692 |
| 0.7972222222222222 | 83.205 |
| 0.7979166666666666 | 83.205 |
| 0.7986111111111112 | 83.205 |
| 0.7993055555555556 | 83.205 |
| 0.7999999999999999 | 83.205 |
| 0.8006944444444444 | 78.722 |
| 0.8013888888888889 | 78.722 |
| 0.8020833333333334 | 78.722 |
| 0.8027777777777777 | 78.722 |
| 0.8034722222222223 | 74.246 |
| 0.8041666666666667 | 74.246 |
| 0.8048611111111111 | 74.246 |
| 0.8055555555555555 | 74.246 |
| 0.80625 | 74.246 |
| 0.8069444444444445 | 74.246 |
| 0.8076388888888889 | 78.722 |
| 0.8083333333333332 | 78.722 |
| 0.8090277777777778 | 83.205 |
| 0.8097222222222222 | 83.205 |
| 0.8104166666666667 | 83.205 |
| 0.811111111111111 | 87.692 |
| 0.8118055555555556 | 87.692 |
| 0.8125 | 83.205 |
| 0.8131944444444444 | 83.205 |
| 0.813888888888889 | 83.205 |
| 0.8145833333333333 | 78.722 |
| 0.8152777777777778 | 78.722 |
| 0.8159722222222222 | 78.722 |
| 0.8166666666666668 | 74.246 |
| 0.8173611111111111 | 74.246 |
| 0.8180555555555555 | 69.775 |
| 0.81875 | 69.775 |
| 0.8194444444444445 | 65.31 |
| 0.8201388888888889 | 65.31 |
| 0.8208333333333333 | 60.85 |
| 0.8215277777777777 | 56.398 |
| 0.8222222222222223 | 56.398 |
| 0.8229166666666666 | 51.951 |
| 0.8236111111111111 | 47.511 |
| 0.8243055555555556 | 47.511 |
| 0.8250000000000001 | 43.079 |
| 0.8256944444444444 | 43.079 |
| 0.8263888888888888 | 38.653 |
| 0.8270833333333334 | 38.653 |
| 0.8277777777777778 | 38.653 |
| 0.8284722222222222 | 38.653 |
| 0.8291666666666666 | 34.234 |
| 0.8298611111111112 | 34.234 |
| 0.8305555555555556 | 29.823 |
| 0.8312499999999999 | 29.823 |
| 0.8319444444444444 | 29.823 |
| 0.8326388888888889 | 25.419 |
| 0.8333333333333334 | 25.419 |
| 0.8340277777777777 | 21.024 |
| 0.8347222222222223 | 21.024 |
| 0.8354166666666667 | 21.024 |
| 0.8361111111111111 | 16.636 |
| 0.8368055555555555 | 16.636 |
| 0.8375 | 12.257 |
| 0.8381944444444445 | 12.257 |
| 0.8388888888888889 | 7.887 |
| 0.8395833333333332 | 7.887 |
| 0.8402777777777778 | 7.887 |
| 0.8409722222222222 | 3.525 |
| 0.8416666666666667 | 3.525 |
| 0.842361111111111 | 3.525 |
| 0.8430555555555556 | 3.525 |
| 0.84375 | 3.525 |
| 0.8444444444444444 | 3.525 |
| 0.845138888888889 | 3.525 |
| 0.8458333333333333 | 3.525 |
| 0.8465277777777778 | 0 |
| 0.8472222222222222 | 0 |
| 0.8479166666666668 | 0 |
| 0.8486111111111111 | 0 |
| 0.8493055555555555 | 0 |
| 0.85 | 0 |
| 0.8506944444444445 | 0 |
| 0.8513888888888889 | 0 |
| 0.8520833333333333 | 0 |
| 0.8527777777777777 | 0 |
| 0.8534722222222223 | 0 |
| 0.8541666666666666 | 0 |
| 0.8548611111111111 | 0 |
| 0.8555555555555556 | 0 |
| 0.8562500000000001 | 0 |
| 0.8569444444444444 | 0 |
| 0.8576388888888888 | 0 |
| 0.8583333333333334 | 0 |
| 0.8590277777777778 | 0 |
| 0.8597222222222222 | 0 |
| 0.8604166666666666 | 0 |
| 0.8611111111111112 | 0 |
| 0.8618055555555556 | 0 |
| 0.8624999999999999 | 0 |
| 0.8631944444444444 | 0 |
| 0.8638888888888889 | 0 |
| 0.8645833333333334 | 0 |
| 0.8652777777777777 | 0 |
| 0.8659722222222223 | 0 |
| 0.8666666666666667 | 0 |
| 0.8673611111111111 | 0 |
| 0.8680555555555555 | 0 |
| 0.86875 | 0 |
| 0.8694444444444445 | 0 |
| 0.8701388888888889 | 0 |
| 0.8708333333333332 | 0 |
| 0.8715277777777778 | 0 |
| 0.8722222222222222 | 0 |
| 0.8729166666666667 | 0 |
| 0.873611111111111 | 0 |
| 0.8743055555555556 | 0 |
| 0.875 | 0 |
| 0.8756944444444444 | 0 |
| 0.876388888888889 | 0 |
| 0.8770833333333333 | 0 |
| 0.8777777777777778 | 0 |
| 0.8784722222222222 | 0 |
| 0.8791666666666668 | 0 |
| 0.8798611111111111 | 0 |
| 0.8805555555555555 | 0 |
| 0.88125 | 0 |
| 0.8819444444444445 | 0 |
| 0.8826388888888889 | 0 |
| 0.8833333333333333 | 0 |
| 0.8840277777777777 | 0 |
| 0.8847222222222223 | 0 |
| 0.8854166666666666 | 0 |
| 0.8861111111111111 | 0 |
| 0.8868055555555556 | 0 |
| 0.8875000000000001 | 0 |
| 0.8881944444444444 | 0 |
| 0.8888888888888888 | 0 |
| 0.8895833333333334 | 0 |
| 0.8902777777777778 | 0 |
| 0.8909722222222222 | 0 |
| 0.8916666666666666 | 0 |
| 0.8923611111111112 | 0 |
| 0.8930555555555556 | 0 |
| 0.8937499999999999 | 0 |
| 0.8944444444444444 | 0 |
| 0.8951388888888889 | 0 |
| 0.8958333333333334 | 0 |
| 0.8965277777777777 | 0 |
| 0.8972222222222223 | 0 |
| 0.8979166666666667 | 0 |
| 0.8986111111111111 | 0 |
| 0.8993055555555555 | 0 |
| 0.9 | 0 |
| 0.9006944444444445 | 0 |
| 0.9013888888888889 | 0 |
| 0.9020833333333332 | 0 |
| 0.9027777777777778 | 0 |
| 0.9034722222222222 | 0 |
| 0.9041666666666667 | 0 |
| 0.904861111111111 | 0 |
| 0.9055555555555556 | 0 |
| 0.90625 | 0 |
| 0.9069444444444444 | 0 |
| 0.907638888888889 | 0 |
| 0.9083333333333333 | 0 |
| 0.9090277777777778 | 0 |
| 0.9097222222222222 | 0 |
| 0.9104166666666668 | 0 |
| 0.9111111111111111 | 0 |
| 0.9118055555555555 | 0 |
| 0.9125 | 0 |
| 0.9131944444444445 | 0 |
| 0.9138888888888889 | 0 |
| 0.9145833333333333 | 0 |
| 0.9152777777777777 | 0 |
| 0.9159722222222223 | 0 |
| 0.9166666666666666 | 0 |
| 0.9173611111111111 | 0 |
| 0.9180555555555556 | 0 |
| 0.9187500000000001 | 0 |
| 0.9194444444444444 | 0 |
| 0.9201388888888888 | 0 |
| 0.9208333333333334 | 0 |
| 0.9215277777777778 | 0 |
| 0.9222222222222222 | 0 |
| 0.9229166666666666 | 0 |
| 0.9236111111111112 | 0 |
| 0.9243055555555556 | 0 |
| 0.9249999999999999 | 0 |
| 0.9256944444444444 | 0 |
| 0.9263888888888889 | 0 |
| 0.9270833333333334 | 0 |
| 0.9277777777777777 | 0 |
| 0.9284722222222223 | 0 |
| 0.9291666666666667 | 0 |
| 0.9298611111111111 | 0 |
| 0.9305555555555555 | 0 |
| 0.93125 | 0 |
| 0.9319444444444445 | 0 |
| 0.9326388888888889 | 0 |
| 0.9333333333333332 | 0 |
| 0.9340277777777778 | 0 |
| 0.9347222222222222 | 0 |
| 0.9354166666666667 | 0 |
| 0.936111111111111 | 0 |
| 0.9368055555555556 | 0 |
| 0.9375 | 0 |
| 0.9381944444444444 | 0 |
| 0.938888888888889 | 0 |
| 0.9395833333333333 | 0 |
| 0.9402777777777778 | 0 |
| 0.9409722222222222 | 0 |
| 0.9416666666666668 | 0 |
| 0.9423611111111111 | 0 |
| 0.9430555555555555 | 0 |
| 0.94375 | 0 |
| 0.9444444444444445 | 0 |
| 0.9451388888888889 | 0 |
| 0.9458333333333333 | 0 |
| 0.9465277777777777 | 0 |
| 0.9472222222222223 | 0 |
| 0.9479166666666666 | 0 |
| 0.9486111111111111 | 0 |
| 0.9493055555555556 | 0 |
| 0.9500000000000001 | 0 |
| 0.9506944444444444 | 0 |
| 0.9513888888888888 | 0 |
| 0.9520833333333334 | 0 |
| 0.9527777777777778 | 0 |
| 0.9534722222222222 | 0 |
| 0.9541666666666666 | 0 |
| 0.9548611111111112 | 0 |
| 0.9555555555555556 | 0 |
| 0.9562499999999999 | 0 |
| 0.9569444444444444 | 0 |
| 0.9576388888888889 | 0 |
| 0.9583333333333334 | 0 |
| 0.9590277777777777 | 0 |
| 0.9597222222222223 | 0 |
| 0.9604166666666667 | 0 |
| 0.9611111111111111 | 0 |
| 0.9618055555555555 | 0 |
| 0.9625 | 0 |
| 0.9631944444444445 | 0 |
| 0.9638888888888889 | 0 |
| 0.9645833333333332 | 0 |
| 0.9652777777777778 | 0 |
| 0.9659722222222222 | 0 |
| 0.9666666666666667 | 0 |
| 0.967361111111111 | 0 |
| 0.9680555555555556 | 0 |
| 0.96875 | 0 |
| 0.9694444444444444 | 0 |
| 0.970138888888889 | 0 |
| 0.9708333333333333 | 0 |
| 0.9715277777777778 | 0 |
| 0.9722222222222222 | 0 |
| 0.9729166666666668 | 0 |
| 0.9736111111111111 | 0 |
| 0.9743055555555555 | 0 |
| 0.975 | 0 |
| 0.9756944444444445 | 0 |
| 0.9763888888888889 | 0 |
| 0.9770833333333333 | 0 |
| 0.9777777777777777 | 0 |
| 0.9784722222222223 | 0 |
| 0.9791666666666666 | 0 |
| 0.9798611111111111 | 0 |
| 0.9805555555555556 | 0 |
| 0.9812500000000001 | 0 |
| 0.9819444444444444 | 0 |
| 0.9826388888888888 | 0 |
| 0.9833333333333334 | 0 |
| 0.9840277777777778 | 0 |
| 0.9847222222222222 | 0 |
| 0.9854166666666666 | 0 |
| 0.9861111111111112 | 0 |
| 0.9868055555555556 | 0 |
| 0.9874999999999999 | 0 |
| 0.9881944444444444 | 0 |
| 0.9888888888888889 | 0 |
| 0.9895833333333334 | 0 |
| 0.9902777777777777 | 0 |
| 0.9909722222222223 | 0 |
| 0.9916666666666667 | 0 |
| 0.9923611111111111 | 0 |
| 0.9930555555555555 | 0 |
| 0.99375 | 0 |
| 0.9944444444444445 | 0 |
| 0.9951388888888889 | 0 |
| 0.9958333333333332 | 0 |
| 0.9965277777777778 | 0 |
| 0.9972222222222222 | 0 |
| 0.9979166666666667 | 0 |
| 0.998611111111111 | 0 |
| 0.9993055555555556 | 0 |